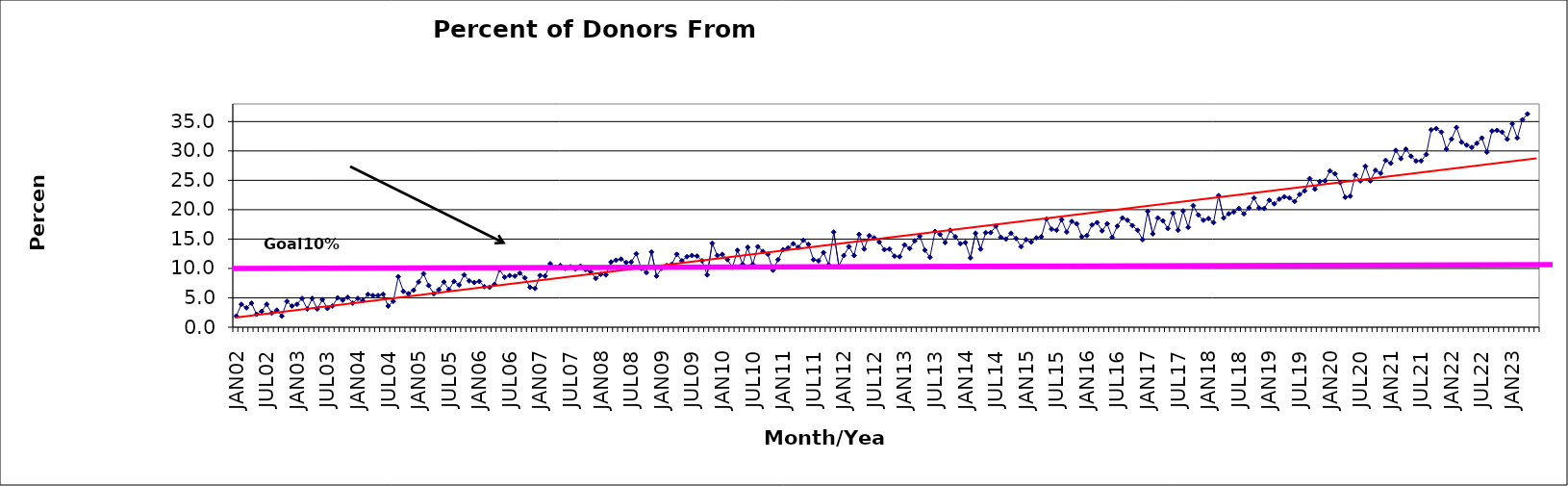
| Category | Series 0 |
|---|---|
| JAN02 | 1.9 |
| FEB02 | 3.9 |
| MAR02 | 3.3 |
| APR02 | 4.1 |
| MAY02 | 2.2 |
| JUN02 | 2.7 |
| JUL02 | 3.9 |
| AUG02 | 2.4 |
| SEP02 | 2.9 |
| OCT02 | 1.9 |
| NOV02 | 4.4 |
| DEC02 | 3.6 |
| JAN03 | 3.9 |
| FEB03 | 4.9 |
| MAR03 | 3.1 |
| APR03 | 4.9 |
| MAY03 | 3.1 |
| JUN03 | 4.7 |
| JUL03 | 3.2 |
| AUG03 | 3.6 |
| SEP03 | 5 |
| OCT03 | 4.6 |
| NOV03 | 5.1 |
| DEC03 | 4.1 |
| JAN04 | 4.9 |
| FEB04 | 4.5 |
| MAR04 | 5.6 |
| APR04 | 5.4 |
| MAY04 | 5.4 |
| JUN04 | 5.6 |
| JUL04 | 3.6 |
| AUG04 | 4.4 |
| SEP04 | 8.6 |
| OCT04 | 6.1 |
| NOV04 | 5.7 |
| DEC04 | 6.3 |
| JAN05 | 7.7 |
| FEB05 | 9.1 |
| MAR05 | 7.1 |
| APR05 | 5.7 |
| MAY05 | 6.4 |
| JUN05 | 7.7 |
| JUL05 | 6.4 |
| AUG05 | 7.8 |
| SEP05 | 7.2 |
| OCT05 | 8.9 |
| NOV05 | 7.9 |
| DEC05 | 7.6 |
| JAN06 | 7.8 |
| FEB06 | 6.9 |
| MAR06 | 6.8 |
| APR06 | 7.3 |
| MAY06 | 9.8 |
| JUN06 | 8.5 |
| JUL06 | 8.8 |
| AUG06 | 8.7 |
| SEP06 | 9.2 |
| OCT06 | 8.4 |
| NOV06 | 6.8 |
| DEC06 | 6.6 |
| JAN07 | 8.8 |
| FEB07 | 8.7 |
| MAR07 | 10.8 |
| APR07 | 10.2 |
| MAY07 | 10.5 |
| JUN07 | 10 |
| JUL07 | 10.3 |
| AUG07 | 9.9 |
| SEP07 | 10.4 |
| OCT07 | 9.8 |
| NOV07 | 9.4 |
| DEC07 | 8.3 |
| JAN08 | 9 |
| FEB08 | 8.9 |
| MAR08 | 11.1 |
| APR08 | 11.4 |
| MAY08 | 11.6 |
| JUN08 | 11 |
| JUL08 | 11.1 |
| AUG08 | 12.5 |
| SEP08 | 10 |
| OCT08 | 9.3 |
| NOV08 | 12.8 |
| DEC08 | 8.7 |
| JAN09 | 10 |
| FEB09 | 10.5 |
| MAR09 | 10.7 |
| APR09 | 12.4 |
| MAY09 | 11.3 |
| JUN09 | 12 |
| JUL09 | 12.2 |
| AUG09 | 12.1 |
| SEP09 | 11.3 |
| OCT09 | 8.9 |
| NOV09 | 14.3 |
| DEC09 | 12.2 |
| JAN10 | 12.4 |
| FEB10 | 11.5 |
| MAR10 | 10.2 |
| APR10 | 13.1 |
| MAY10 | 10.7 |
| JUN10 | 13.6 |
| JUL10 | 10.7 |
| AUG10 | 13.7 |
| SEP10 | 12.9 |
| OCT10 | 12.4 |
| NOV10 | 9.7 |
| DEC10 | 11.5 |
| JAN11 | 13.2 |
| FEB11 | 13.5 |
| MAR11 | 14.2 |
| APR11 | 13.6 |
| MAY11 | 14.8 |
| JUN11 | 14.1 |
| JUL11 | 11.5 |
| AUG11 | 11.3 |
| SEP11 | 12.7 |
| OCT11 | 10.6 |
| NOV11 | 16.2 |
| DEC11 | 10.4 |
| JAN12 | 12.2 |
| FEB12 | 13.7 |
| MAR12 | 12.2 |
| APR12 | 15.8 |
| MAY12 | 13.3 |
| JUN12 | 15.6 |
| JUL12 | 15.2 |
| AUG12 | 14.5 |
| SEP12 | 13.2 |
| OCT12 | 13.3 |
| NOV12 | 12.1 |
| DEC12 | 12 |
| JAN13 | 14 |
| FEB13 | 13.4 |
| MAR13 | 14.7 |
| APR13 | 15.5 |
| MAY13 | 13.1 |
| JUN13 | 11.9 |
| JUL13 | 16.3 |
| AUG13 | 15.8 |
| SEP13 | 14.4 |
| OCT13 | 16.5 |
| NOV13 | 15.4 |
| DEC13 | 14.2 |
| JAN14 | 14.4 |
| FEB14 | 11.8 |
| MAR14 | 16 |
| APR14 | 13.3 |
| MAY14 | 16.1 |
| JUN14 | 16.1 |
| JUL14 | 17.2 |
| AUG14 | 15.3 |
| SEP14 | 15 |
| OCT14 | 16 |
| NOV14 | 15.1 |
| DEC14 | 13.7 |
| JAN15 | 14.9 |
| FEB15 | 14.5 |
| MAR15 | 15.2 |
| APR15 | 15.4 |
| MAY15 | 18.4 |
| JUN15 | 16.7 |
| JUL15 | 16.5 |
| AUG15 | 18.3 |
| SEP15 | 16.2 |
| OCT15 | 18 |
| NOV15 | 17.6 |
| DEC15 | 15.4 |
| JAN16 | 15.6 |
| FEB16 | 17.4 |
| MAR16 | 17.8 |
| APR16 | 16.4 |
| MAY16 | 17.6 |
| JUN16 | 15.3 |
| JUL16 | 17.2 |
| AUG16 | 18.6 |
| SEP16 | 18.2 |
| OCT16 | 17.3 |
| NOV16 | 16.5 |
| DEC16 | 14.9 |
| JAN17 | 19.7 |
| FEB17 | 15.9 |
| MAR17 | 18.6 |
| APR17 | 18.1 |
| MAY17 | 16.8 |
| JUN17 | 19.4 |
| JUL17 | 16.5 |
| AUG17 | 19.8 |
| SEP17 | 17 |
| OCT17 | 20.7 |
| NOV17 | 19.1 |
| DEC17 | 18.2 |
| JAN18 | 18.5 |
| FEB18 | 17.8 |
| MAR18 | 22.4 |
| APR18 | 18.6 |
| MAY18 | 19.3 |
| JUN18 | 19.6 |
| JUL18 | 20.2 |
| AUG18 | 19.3 |
| SEP18 | 20.3 |
| OCT18 | 22 |
| NOV18 | 20.3 |
| DEC18 | 20.2 |
| JAN19 | 21.6 |
| FEB19 | 21 |
| MAR19 | 21.8 |
| APR19 | 22.2 |
| MAY19 | 22 |
| JUN19 | 21.4 |
| JUL19 | 22.6 |
| AUG19 | 23.2 |
| SEP19 | 25.3 |
| OCT19 | 23.5 |
| NOV19 | 24.8 |
| DEC19 | 24.9 |
| JAN20 | 26.6 |
| FEB20 | 26.1 |
| MAR20 | 24.6 |
| APR20 | 22.1 |
| MAY20 | 22.3 |
| JUN20 | 25.9 |
| JUL20 | 24.9 |
| AUG20 | 27.4 |
| SEP20 | 24.9 |
| OCT20 | 26.7 |
| NOV20 | 26.2 |
| DEC20 | 28.4 |
| JAN21 | 27.9 |
| FEB21 | 30.1 |
| MAR21 | 28.7 |
| APR21 | 30.3 |
| MAY21 | 29.1 |
| JUN21 | 28.3 |
| JUL21 | 28.3 |
| AUG21 | 29.4 |
| SEP21 | 33.6 |
| OCT21 | 33.8 |
| NOV21 | 33.2 |
| DEC21 | 30.3 |
| JAN22 | 32 |
| FEB22 | 34 |
| MAR22 | 31.5 |
| APR22 | 31 |
| MAY22 | 30.6 |
| JUN22 | 31.3 |
| JUL22 | 32.2 |
| AUG22 | 29.8 |
| SEP22 | 33.4 |
| OCT22 | 33.5 |
| NOV22 | 33.2 |
| DEC22 | 32 |
| JAN23 | 34.6 |
| FEB23 | 32.2 |
| MAR23 | 35.3 |
| APR23 | 36.3 |